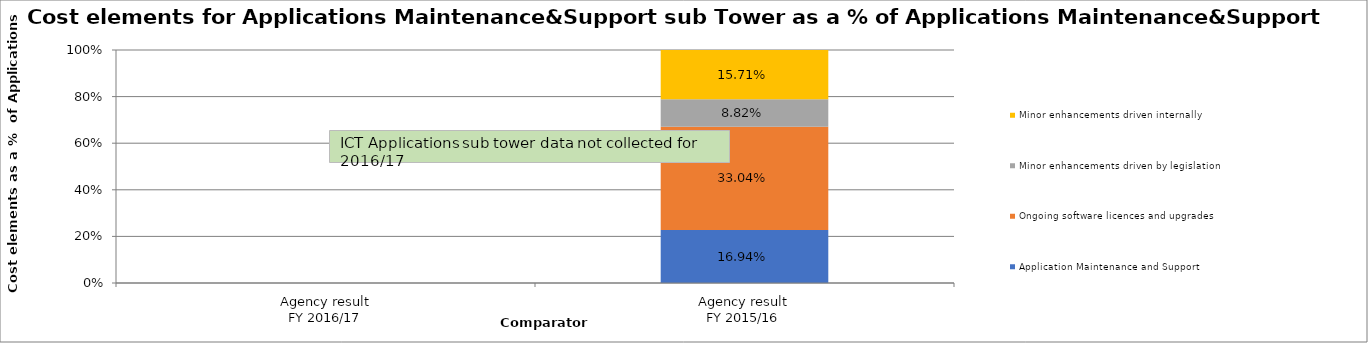
| Category | Application Maintenance and Support | Ongoing software licences and upgrades | Minor enhancements driven by legislation | Minor enhancements driven internally |
|---|---|---|---|---|
| Agency result
FY 2016/17 | 0 | 0 | 0 | 0 |
| Agency result
FY 2015/16 | 0.169 | 0.33 | 0.088 | 0.157 |